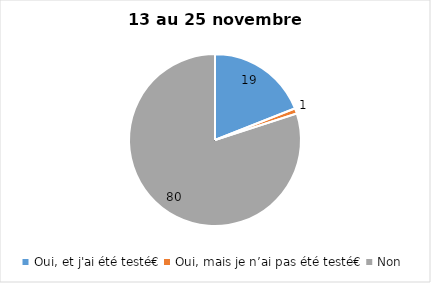
| Category | Series 0 |
|---|---|
| Oui, et j'ai été testé€ | 19 |
| Oui, mais je n’ai pas été testé€ | 1 |
| Non | 80 |